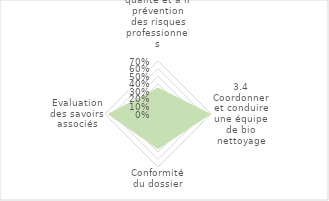
| Category | % |
|---|---|
| 0 | 0.35 |
| 1 | 0.7 |
| 2 | 0.467 |
| 3 | 0.667 |